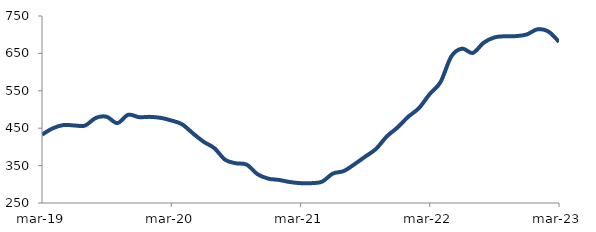
| Category | Series 0 |
|---|---|
| 2019-03-01 | 432.718 |
| 2019-04-01 | 449.714 |
| 2019-05-01 | 458.458 |
| 2019-06-01 | 457.312 |
| 2019-07-01 | 457.058 |
| 2019-08-01 | 477.544 |
| 2019-09-01 | 480.652 |
| 2019-10-01 | 463.67 |
| 2019-11-01 | 485.887 |
| 2019-12-01 | 479.593 |
| 2020-01-01 | 480.293 |
| 2020-02-01 | 477.774 |
| 2020-03-01 | 470.708 |
| 2020-04-01 | 460.537 |
| 2020-05-01 | 436.562 |
| 2020-06-01 | 413.857 |
| 2020-07-01 | 396.652 |
| 2020-08-01 | 365.687 |
| 2020-09-01 | 356.18 |
| 2020-10-01 | 352.658 |
| 2020-11-01 | 327.164 |
| 2020-12-01 | 315.173 |
| 2021-01-01 | 311.708 |
| 2021-02-01 | 306.103 |
| 2021-03-01 | 303.075 |
| 2021-04-01 | 303.034 |
| 2021-05-01 | 306.996 |
| 2021-06-01 | 328.614 |
| 2021-07-01 | 335.232 |
| 2021-08-01 | 353.414 |
| 2021-09-01 | 373.869 |
| 2021-10-01 | 394.393 |
| 2021-11-01 | 427.592 |
| 2021-12-01 | 451.83 |
| 2022-01-01 | 480.528 |
| 2022-02-01 | 503.882 |
| 2022-03-01 | 541.428 |
| 2022-04-01 | 573.261 |
| 2022-05-01 | 641.774 |
| 2022-06-01 | 662.728 |
| 2022-07-01 | 651.267 |
| 2022-08-01 | 678.506 |
| 2022-09-01 | 692.688 |
| 2022-10-01 | 695.873 |
| 2022-11-01 | 696.235 |
| 2022-12-01 | 700.598 |
| 2023-01-01 | 714.422 |
| 2023-02-01 | 708.75 |
| 2023-03-01 | 680.994 |